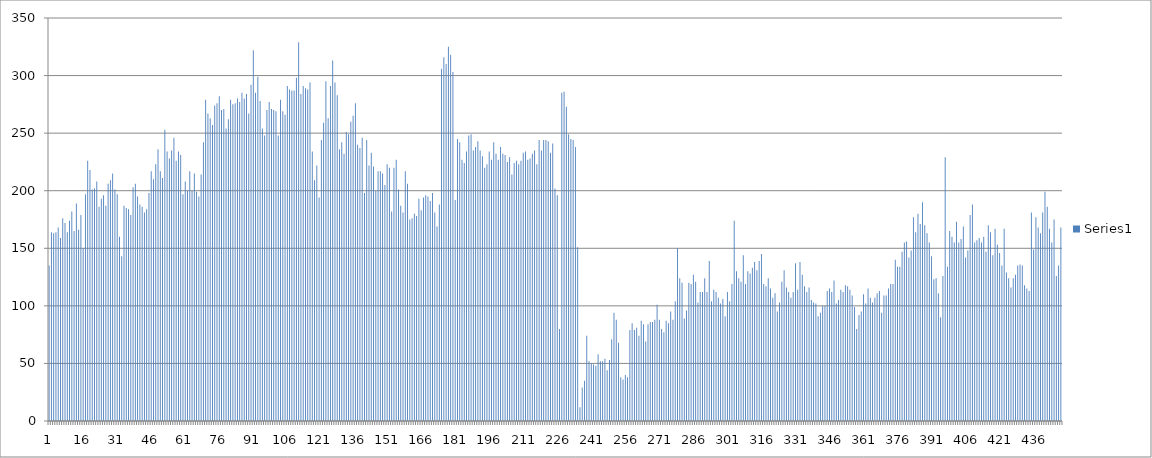
| Category | Series 0 |
|---|---|
| 0 | 135 |
| 1 | 164 |
| 2 | 163 |
| 3 | 164 |
| 4 | 168 |
| 5 | 159 |
| 6 | 176 |
| 7 | 172 |
| 8 | 164 |
| 9 | 174 |
| 10 | 182 |
| 11 | 165 |
| 12 | 189 |
| 13 | 166 |
| 14 | 179 |
| 15 | 150 |
| 16 | 197 |
| 17 | 226 |
| 18 | 218 |
| 19 | 201 |
| 20 | 202 |
| 21 | 208 |
| 22 | 186 |
| 23 | 193 |
| 24 | 196 |
| 25 | 187 |
| 26 | 206 |
| 27 | 209 |
| 28 | 215 |
| 29 | 201 |
| 30 | 197 |
| 31 | 160 |
| 32 | 143 |
| 33 | 187 |
| 34 | 185 |
| 35 | 184 |
| 36 | 179 |
| 37 | 203 |
| 38 | 206 |
| 39 | 195 |
| 40 | 188 |
| 41 | 186 |
| 42 | 181 |
| 43 | 184 |
| 44 | 198 |
| 45 | 217 |
| 46 | 210 |
| 47 | 223 |
| 48 | 236 |
| 49 | 217 |
| 50 | 211 |
| 51 | 253 |
| 52 | 234 |
| 53 | 228 |
| 54 | 235 |
| 55 | 246 |
| 56 | 226 |
| 57 | 234 |
| 58 | 231 |
| 59 | 197 |
| 60 | 208 |
| 61 | 200 |
| 62 | 217 |
| 63 | 200 |
| 64 | 215 |
| 65 | 199 |
| 66 | 195 |
| 67 | 214 |
| 68 | 242 |
| 69 | 279 |
| 70 | 267 |
| 71 | 263 |
| 72 | 257 |
| 73 | 274 |
| 74 | 276 |
| 75 | 282 |
| 76 | 270 |
| 77 | 271 |
| 78 | 254 |
| 79 | 262 |
| 80 | 279 |
| 81 | 275 |
| 82 | 276 |
| 83 | 280 |
| 84 | 277 |
| 85 | 285 |
| 86 | 280 |
| 87 | 284 |
| 88 | 267 |
| 89 | 292 |
| 90 | 322 |
| 91 | 285 |
| 92 | 299 |
| 93 | 278 |
| 94 | 254 |
| 95 | 248 |
| 96 | 270 |
| 97 | 277 |
| 98 | 271 |
| 99 | 270 |
| 100 | 269 |
| 101 | 248 |
| 102 | 279 |
| 103 | 269 |
| 104 | 266 |
| 105 | 291 |
| 106 | 288 |
| 107 | 287 |
| 108 | 287 |
| 109 | 298 |
| 110 | 329 |
| 111 | 284 |
| 112 | 291 |
| 113 | 289 |
| 114 | 288 |
| 115 | 294 |
| 116 | 234 |
| 117 | 209 |
| 118 | 222 |
| 119 | 194 |
| 120 | 244 |
| 121 | 259 |
| 122 | 295 |
| 123 | 263 |
| 124 | 291 |
| 125 | 313 |
| 126 | 294 |
| 127 | 283 |
| 128 | 236 |
| 129 | 242 |
| 130 | 232 |
| 131 | 251 |
| 132 | 249 |
| 133 | 260 |
| 134 | 265 |
| 135 | 276 |
| 136 | 240 |
| 137 | 237 |
| 138 | 246 |
| 139 | 198 |
| 140 | 244 |
| 141 | 222 |
| 142 | 233 |
| 143 | 221 |
| 144 | 200 |
| 145 | 217 |
| 146 | 217 |
| 147 | 215 |
| 148 | 205 |
| 149 | 223 |
| 150 | 220 |
| 151 | 182 |
| 152 | 220 |
| 153 | 227 |
| 154 | 201 |
| 155 | 187 |
| 156 | 181 |
| 157 | 217 |
| 158 | 206 |
| 159 | 175 |
| 160 | 176 |
| 161 | 180 |
| 162 | 178 |
| 163 | 193 |
| 164 | 183 |
| 165 | 194 |
| 166 | 196 |
| 167 | 195 |
| 168 | 191 |
| 169 | 198 |
| 170 | 181 |
| 171 | 169 |
| 172 | 188 |
| 173 | 306 |
| 174 | 316 |
| 175 | 310 |
| 176 | 325 |
| 177 | 318 |
| 178 | 303 |
| 179 | 192 |
| 180 | 245 |
| 181 | 242 |
| 182 | 227 |
| 183 | 224 |
| 184 | 234 |
| 185 | 248 |
| 186 | 249 |
| 187 | 235 |
| 188 | 238 |
| 189 | 243 |
| 190 | 235 |
| 191 | 230 |
| 192 | 220 |
| 193 | 223 |
| 194 | 234 |
| 195 | 227 |
| 196 | 242 |
| 197 | 232 |
| 198 | 227 |
| 199 | 238 |
| 200 | 232 |
| 201 | 231 |
| 202 | 225 |
| 203 | 229 |
| 204 | 214 |
| 205 | 224 |
| 206 | 226 |
| 207 | 223 |
| 208 | 226 |
| 209 | 233 |
| 210 | 234 |
| 211 | 227 |
| 212 | 228 |
| 213 | 232 |
| 214 | 235 |
| 215 | 223 |
| 216 | 244 |
| 217 | 235 |
| 218 | 244 |
| 219 | 244 |
| 220 | 243 |
| 221 | 233 |
| 222 | 241 |
| 223 | 202 |
| 224 | 196 |
| 225 | 80 |
| 226 | 285 |
| 227 | 286 |
| 228 | 273 |
| 229 | 249 |
| 230 | 245 |
| 231 | 244 |
| 232 | 238 |
| 233 | 151 |
| 234 | 12 |
| 235 | 29 |
| 236 | 35 |
| 237 | 74 |
| 238 | 52 |
| 239 | 50 |
| 240 | 49 |
| 241 | 48 |
| 242 | 58 |
| 243 | 52 |
| 244 | 52 |
| 245 | 54 |
| 246 | 44 |
| 247 | 53 |
| 248 | 71 |
| 249 | 94 |
| 250 | 88 |
| 251 | 68 |
| 252 | 38 |
| 253 | 36 |
| 254 | 40 |
| 255 | 38 |
| 256 | 79 |
| 257 | 85 |
| 258 | 79 |
| 259 | 81 |
| 260 | 74 |
| 261 | 87 |
| 262 | 84 |
| 263 | 69 |
| 264 | 84 |
| 265 | 86 |
| 266 | 86 |
| 267 | 88 |
| 268 | 101 |
| 269 | 88 |
| 270 | 80 |
| 271 | 77 |
| 272 | 87 |
| 273 | 85 |
| 274 | 95 |
| 275 | 88 |
| 276 | 104 |
| 277 | 150 |
| 278 | 124 |
| 279 | 120 |
| 280 | 89 |
| 281 | 96 |
| 282 | 120 |
| 283 | 119 |
| 284 | 127 |
| 285 | 121 |
| 286 | 103 |
| 287 | 112 |
| 288 | 112 |
| 289 | 124 |
| 290 | 112 |
| 291 | 139 |
| 292 | 104 |
| 293 | 114 |
| 294 | 112 |
| 295 | 107 |
| 296 | 102 |
| 297 | 106 |
| 298 | 91 |
| 299 | 112 |
| 300 | 104 |
| 301 | 119 |
| 302 | 174 |
| 303 | 130 |
| 304 | 124 |
| 305 | 121 |
| 306 | 144 |
| 307 | 119 |
| 308 | 130 |
| 309 | 128 |
| 310 | 133 |
| 311 | 138 |
| 312 | 131 |
| 313 | 139 |
| 314 | 145 |
| 315 | 119 |
| 316 | 117 |
| 317 | 124 |
| 318 | 115 |
| 319 | 107 |
| 320 | 111 |
| 321 | 95 |
| 322 | 103 |
| 323 | 121 |
| 324 | 131 |
| 325 | 116 |
| 326 | 112 |
| 327 | 107 |
| 328 | 112 |
| 329 | 137 |
| 330 | 114 |
| 331 | 138 |
| 332 | 127 |
| 333 | 117 |
| 334 | 112 |
| 335 | 116 |
| 336 | 105 |
| 337 | 103 |
| 338 | 102 |
| 339 | 91 |
| 340 | 94 |
| 341 | 100 |
| 342 | 100 |
| 343 | 113 |
| 344 | 115 |
| 345 | 112 |
| 346 | 122 |
| 347 | 102 |
| 348 | 105 |
| 349 | 114 |
| 350 | 112 |
| 351 | 118 |
| 352 | 117 |
| 353 | 114 |
| 354 | 109 |
| 355 | 99 |
| 356 | 80 |
| 357 | 92 |
| 358 | 95 |
| 359 | 110 |
| 360 | 102 |
| 361 | 115 |
| 362 | 107 |
| 363 | 103 |
| 364 | 107 |
| 365 | 111 |
| 366 | 113 |
| 367 | 94 |
| 368 | 109 |
| 369 | 109 |
| 370 | 115 |
| 371 | 119 |
| 372 | 119 |
| 373 | 140 |
| 374 | 134 |
| 375 | 134 |
| 376 | 147 |
| 377 | 155 |
| 378 | 156 |
| 379 | 142 |
| 380 | 148 |
| 381 | 177 |
| 382 | 164 |
| 383 | 180 |
| 384 | 171 |
| 385 | 190 |
| 386 | 170 |
| 387 | 163 |
| 388 | 155 |
| 389 | 143 |
| 390 | 123 |
| 391 | 124 |
| 392 | 111 |
| 393 | 90 |
| 394 | 126 |
| 395 | 229 |
| 396 | 134 |
| 397 | 165 |
| 398 | 160 |
| 399 | 155 |
| 400 | 173 |
| 401 | 155 |
| 402 | 158 |
| 403 | 169 |
| 404 | 142 |
| 405 | 148 |
| 406 | 179 |
| 407 | 188 |
| 408 | 155 |
| 409 | 157 |
| 410 | 159 |
| 411 | 155 |
| 412 | 160 |
| 413 | 147 |
| 414 | 170 |
| 415 | 164 |
| 416 | 144 |
| 417 | 167 |
| 418 | 153 |
| 419 | 146 |
| 420 | 135 |
| 421 | 167 |
| 422 | 129 |
| 423 | 124 |
| 424 | 116 |
| 425 | 124 |
| 426 | 127 |
| 427 | 135 |
| 428 | 136 |
| 429 | 135 |
| 430 | 118 |
| 431 | 115 |
| 432 | 113 |
| 433 | 181 |
| 434 | 149 |
| 435 | 177 |
| 436 | 168 |
| 437 | 163 |
| 438 | 181 |
| 439 | 199 |
| 440 | 186 |
| 441 | 167 |
| 442 | 155 |
| 443 | 175 |
| 444 | 126 |
| 445 | 135 |
| 446 | 168 |